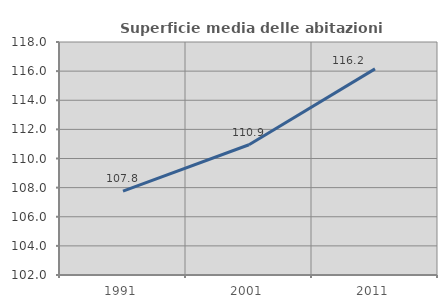
| Category | Superficie media delle abitazioni occupate |
|---|---|
| 1991.0 | 107.764 |
| 2001.0 | 110.944 |
| 2011.0 | 116.154 |